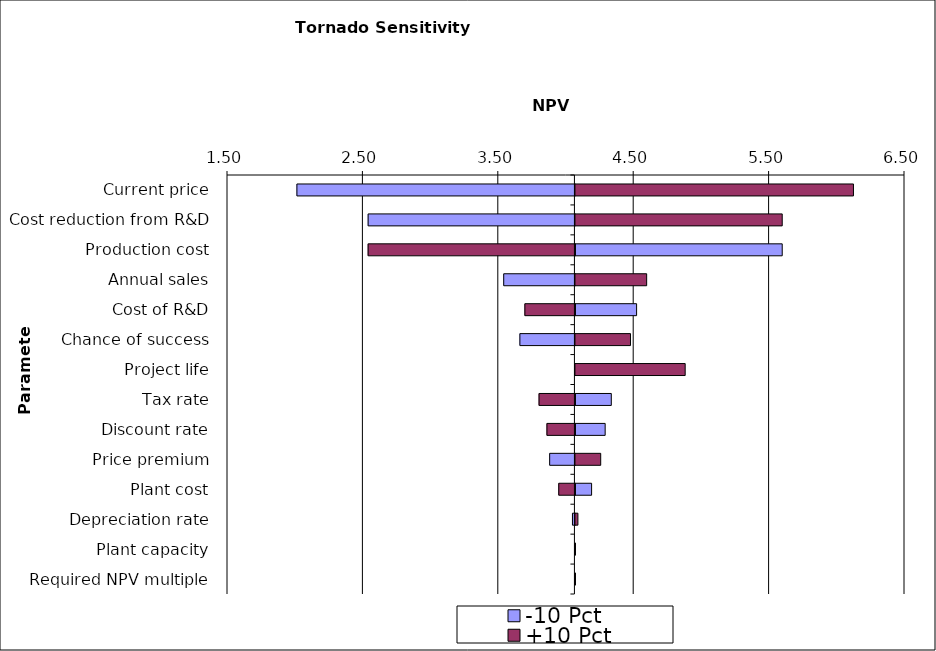
| Category | -10 Pct | +10 Pct |
|---|---|---|
| Current price | 2.013 | 6.119 |
| Cost reduction from R&D | 2.539 | 5.593 |
| Production cost | 5.593 | 2.539 |
| Annual sales | 3.54 | 4.592 |
| Cost of R&D | 4.518 | 3.696 |
| Chance of success | 3.659 | 4.473 |
| Project life | 4.066 | 4.877 |
| Tax rate | 4.331 | 3.801 |
| Discount rate | 4.285 | 3.859 |
| Price premium | 3.879 | 4.253 |
| Plant cost | 4.185 | 3.947 |
| Depreciation rate | 4.048 | 4.084 |
| Plant capacity | 4.066 | 4.066 |
| Required NPV multiple | 4.066 | 4.066 |